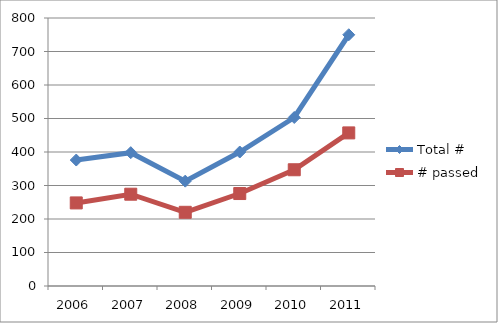
| Category | Total # | # passed |
|---|---|---|
| 2006.0 | 376 | 248 |
| 2007.0 | 398 | 274 |
| 2008.0 | 313 | 220 |
| 2009.0 | 400 | 276 |
| 2010.0 | 503 | 347 |
| 2011.0 | 750 | 457 |